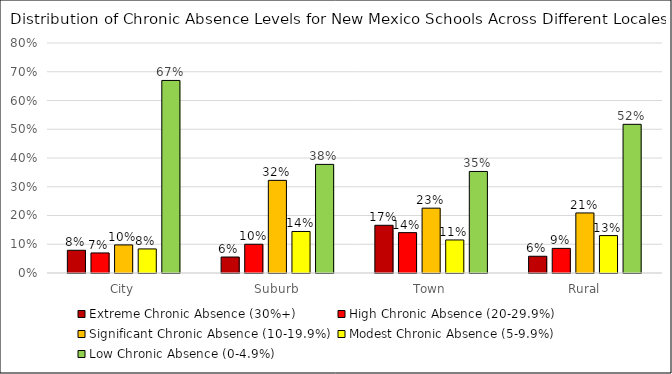
| Category | Extreme Chronic Absence (30%+) | High Chronic Absence (20-29.9%) | Significant Chronic Absence (10-19.9%) | Modest Chronic Absence (5-9.9%) | Low Chronic Absence (0-4.9%) |
|---|---|---|---|---|---|
| City | 0.079 | 0.07 | 0.098 | 0.084 | 0.67 |
| Suburb | 0.056 | 0.1 | 0.322 | 0.144 | 0.378 |
| Town | 0.166 | 0.14 | 0.226 | 0.115 | 0.353 |
| Rural | 0.058 | 0.086 | 0.209 | 0.13 | 0.517 |